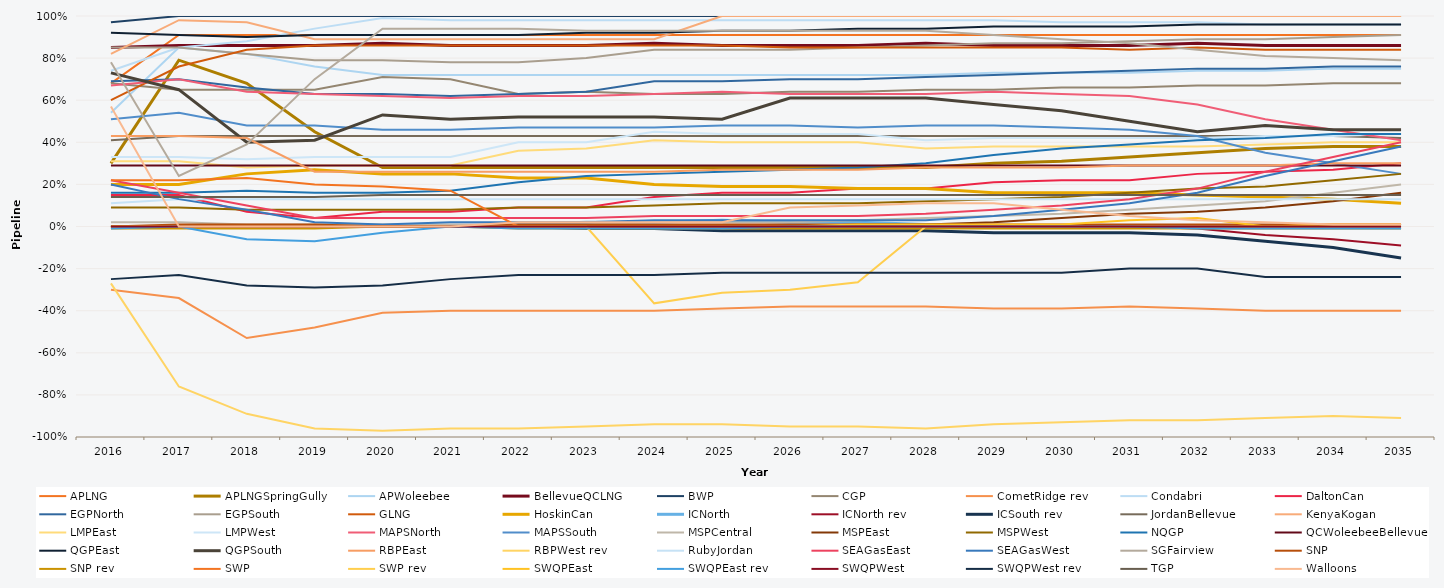
| Category | APLNG | APLNGSpringGully | APWoleebee | BellevueQCLNG | BWP | CGP | CometRidge rev | Condabri | DaltonCan | EGPNorth | EGPSouth | GLNG | HoskinCan | ICNorth | ICNorth rev | ICSouth rev | JordanBellevue | KenyaKogan | LMPEast | LMPWest | MAPSNorth | MAPSSouth | MSPCentral | MSPEast | MSPWest | NQGP | QCWoleebeeBellevue | QGPEast | QGPSouth | RBPEast | RBPWest rev | RubyJordan | SEAGasEast | SEAGasWest | SGFairview | SNP | SNP rev | SWP | SWP rev | SWQPEast | SWQPEast rev | SWQPWest | SWQPWest rev | TGP | Walloons |
|---|---|---|---|---|---|---|---|---|---|---|---|---|---|---|---|---|---|---|---|---|---|---|---|---|---|---|---|---|---|---|---|---|---|---|---|---|---|---|---|---|---|---|---|---|---|
| 2016.0 | 0.68 | 0.3 | 0.54 | 0.85 | 0.97 | 0.68 | -0.3 | 0.74 | 0.15 | 0.69 | 0.85 | 0.6 | 0.2 | 0 | 0 | 0 | 0.41 | 0.82 | 0.31 | 0.33 | 0.67 | 0.51 | 0.02 | 0 | 0.09 | 0.16 | 0.29 | 0.92 | 0.73 | 0.43 | -0.27 | 0.11 | 0.22 | 0.2 | 0.78 | 0 | -0.01 | 0.22 | 0 | 0 | -0.01 | 0 | -0.25 | 0.14 | 0.57 |
| 2017.0 | 0.91 | 0.79 | 0.85 | 0.86 | 1 | 0.65 | -0.34 | 0.85 | 0.15 | 0.7 | 0.85 | 0.76 | 0.2 | 0 | 0 | 0 | 0.43 | 0.98 | 0.31 | 0.33 | 0.7 | 0.54 | 0.02 | 0 | 0.09 | 0.16 | 0.29 | 0.91 | 0.65 | 0.43 | -0.76 | 0.13 | 0.16 | 0.13 | 0.24 | 0.01 | -0.01 | 0.22 | 0 | 0 | 0 | 0 | -0.23 | 0.14 | 0 |
| 2018.0 | 0.91 | 0.68 | 0.82 | 0.86 | 1 | 0.65 | -0.53 | 0.88 | 0.07 | 0.66 | 0.82 | 0.84 | 0.25 | 0 | 0 | 0 | 0.43 | 0.97 | 0.28 | 0.32 | 0.64 | 0.48 | 0.01 | 0 | 0.08 | 0.17 | 0.29 | 0.9 | 0.4 | 0.42 | -0.89 | 0.13 | 0.1 | 0.08 | 0.39 | 0.01 | -0.01 | 0.23 | 0 | 0 | -0.06 | 0 | -0.28 | 0.14 | 0 |
| 2019.0 | 0.91 | 0.45 | 0.76 | 0.86 | 1 | 0.65 | -0.48 | 0.94 | 0.04 | 0.63 | 0.79 | 0.86 | 0.27 | 0 | 0 | 0 | 0.43 | 0.89 | 0.29 | 0.33 | 0.63 | 0.48 | 0.01 | 0 | 0.08 | 0.16 | 0.29 | 0.91 | 0.41 | 0.26 | -0.96 | 0.13 | 0.04 | 0.02 | 0.7 | 0.01 | -0.01 | 0.2 | 0 | 0 | -0.07 | 0 | -0.29 | 0.14 | 0 |
| 2020.0 | 0.91 | 0.28 | 0.72 | 0.87 | 1 | 0.71 | -0.41 | 0.99 | 0.07 | 0.63 | 0.79 | 0.86 | 0.25 | 0 | 0 | 0 | 0.43 | 0.89 | 0.29 | 0.33 | 0.62 | 0.46 | 0.01 | 0 | 0.08 | 0.16 | 0.29 | 0.91 | 0.53 | 0.26 | -0.97 | 0.13 | 0.04 | 0.01 | 0.94 | 0 | 0 | 0.19 | 0 | 0 | -0.03 | 0 | -0.28 | 0.15 | 0 |
| 2021.0 | 0.91 | 0.28 | 0.72 | 0.86 | 1 | 0.7 | -0.4 | 0.98 | 0.07 | 0.62 | 0.78 | 0.86 | 0.25 | 0 | 0 | 0 | 0.43 | 0.89 | 0.29 | 0.33 | 0.61 | 0.46 | 0.01 | 0 | 0.08 | 0.17 | 0.29 | 0.91 | 0.51 | 0.26 | -0.96 | 0.13 | 0.04 | 0.02 | 0.94 | 0 | 0 | 0.17 | 0 | 0 | 0 | 0 | -0.25 | 0.15 | 0 |
| 2022.0 | 0.91 | 0.28 | 0.72 | 0.86 | 1 | 0.63 | -0.4 | 0.98 | 0.09 | 0.63 | 0.78 | 0.86 | 0.23 | 0.01 | 0 | 0 | 0.43 | 0.89 | 0.36 | 0.4 | 0.62 | 0.47 | 0.01 | 0 | 0.09 | 0.21 | 0.29 | 0.91 | 0.52 | 0.26 | -0.96 | 0.13 | 0.04 | 0.02 | 0.94 | 0.01 | -0.01 | 0 | 0 | 0 | -0.01 | 0 | -0.23 | 0.15 | 0.02 |
| 2023.0 | 0.91 | 0.28 | 0.72 | 0.86 | 1 | 0.64 | -0.4 | 0.98 | 0.09 | 0.64 | 0.8 | 0.86 | 0.23 | 0.02 | 0 | -0.01 | 0.43 | 0.89 | 0.37 | 0.4 | 0.62 | 0.47 | 0.01 | 0 | 0.09 | 0.24 | 0.29 | 0.92 | 0.52 | 0.26 | -0.95 | 0.13 | 0.04 | 0.02 | 0.93 | 0.01 | -0.01 | 0 | 0 | 0 | -0.01 | 0 | -0.23 | 0.15 | 0.02 |
| 2024.0 | 0.91 | 0.28 | 0.72 | 0.87 | 1 | 0.63 | -0.4 | 0.98 | 0.14 | 0.69 | 0.84 | 0.86 | 0.2 | 0.02 | 0 | -0.01 | 0.43 | 0.89 | 0.41 | 0.45 | 0.63 | 0.47 | 0.02 | 0 | 0.1 | 0.25 | 0.29 | 0.92 | 0.52 | 0.26 | -0.94 | 0.13 | 0.05 | 0.03 | 0.93 | 0.01 | -0.01 | 0 | -0.365 | 0 | -0.01 | 0 | -0.23 | 0.15 | 0.02 |
| 2025.0 | 0.91 | 0.28 | 0.72 | 0.86 | 1 | 0.63 | -0.39 | 0.98 | 0.16 | 0.69 | 0.84 | 0.86 | 0.19 | 0.03 | 0 | -0.02 | 0.43 | 1 | 0.4 | 0.44 | 0.64 | 0.48 | 0.02 | 0 | 0.11 | 0.26 | 0.29 | 0.93 | 0.51 | 0.27 | -0.94 | 0.13 | 0.05 | 0.03 | 0.93 | 0.01 | -0.01 | 0 | -0.315 | 0 | -0.01 | 0 | -0.22 | 0.15 | 0.02 |
| 2026.0 | 0.91 | 0.28 | 0.72 | 0.86 | 1 | 0.64 | -0.38 | 0.98 | 0.16 | 0.7 | 0.84 | 0.85 | 0.19 | 0.02 | 0 | -0.02 | 0.43 | 1 | 0.4 | 0.44 | 0.63 | 0.48 | 0.02 | 0 | 0.11 | 0.27 | 0.29 | 0.93 | 0.61 | 0.27 | -0.95 | 0.13 | 0.05 | 0.03 | 0.93 | 0.01 | -0.01 | 0 | -0.3 | 0 | 0 | 0 | -0.22 | 0.15 | 0.09 |
| 2027.0 | 0.91 | 0.28 | 0.72 | 0.86 | 1 | 0.64 | -0.38 | 0.98 | 0.18 | 0.7 | 0.85 | 0.85 | 0.18 | 0.02 | 0 | -0.02 | 0.43 | 1 | 0.4 | 0.44 | 0.63 | 0.47 | 0.03 | 0.01 | 0.11 | 0.28 | 0.29 | 0.94 | 0.61 | 0.27 | -0.95 | 0.13 | 0.05 | 0.03 | 0.93 | 0.01 | -0.01 | 0 | -0.265 | 0.01 | 0 | 0 | -0.22 | 0.15 | 0.1 |
| 2028.0 | 0.91 | 0.28 | 0.72 | 0.87 | 1 | 0.65 | -0.38 | 0.98 | 0.18 | 0.71 | 0.86 | 0.85 | 0.18 | 0.01 | 0 | -0.02 | 0.43 | 1 | 0.37 | 0.41 | 0.63 | 0.48 | 0.04 | 0.01 | 0.12 | 0.3 | 0.29 | 0.94 | 0.61 | 0.28 | -0.96 | 0.13 | 0.06 | 0.03 | 0.93 | 0.01 | -0.01 | 0 | 0 | 0.01 | 0 | 0 | -0.22 | 0.15 | 0.11 |
| 2029.0 | 0.91 | 0.3 | 0.73 | 0.86 | 1 | 0.65 | -0.39 | 0.98 | 0.21 | 0.72 | 0.87 | 0.85 | 0.16 | 0 | 0 | -0.03 | 0.43 | 1 | 0.38 | 0.42 | 0.64 | 0.48 | 0.05 | 0.02 | 0.13 | 0.34 | 0.29 | 0.95 | 0.58 | 0.28 | -0.94 | 0.13 | 0.08 | 0.05 | 0.91 | 0.01 | -0.01 | 0 | 0 | 0.01 | 0 | 0 | -0.22 | 0.15 | 0.11 |
| 2030.0 | 0.91 | 0.31 | 0.73 | 0.86 | 1 | 0.66 | -0.39 | 0.97 | 0.22 | 0.73 | 0.87 | 0.85 | 0.16 | 0 | 0 | -0.03 | 0.43 | 1 | 0.38 | 0.42 | 0.63 | 0.47 | 0.06 | 0.04 | 0.14 | 0.37 | 0.29 | 0.95 | 0.55 | 0.28 | -0.93 | 0.13 | 0.1 | 0.08 | 0.89 | 0.01 | -0.01 | 0 | 0 | 0.01 | 0 | 0 | -0.22 | 0.15 | 0.08 |
| 2031.0 | 0.91 | 0.33 | 0.73 | 0.86 | 1 | 0.66 | -0.38 | 0.97 | 0.22 | 0.74 | 0.88 | 0.84 | 0.16 | 0 | 0 | -0.03 | 0.43 | 1 | 0.38 | 0.42 | 0.62 | 0.46 | 0.08 | 0.06 | 0.16 | 0.39 | 0.29 | 0.95 | 0.5 | 0.29 | -0.92 | 0.13 | 0.13 | 0.11 | 0.87 | 0.01 | -0.01 | 0 | 0 | 0.03 | 0 | 0 | -0.2 | 0.15 | 0.05 |
| 2032.0 | 0.91 | 0.35 | 0.74 | 0.87 | 1 | 0.67 | -0.39 | 0.97 | 0.25 | 0.75 | 0.89 | 0.85 | 0.15 | 0 | -0.01 | -0.04 | 0.43 | 1 | 0.38 | 0.42 | 0.58 | 0.43 | 0.1 | 0.07 | 0.18 | 0.41 | 0.29 | 0.96 | 0.45 | 0.29 | -0.92 | 0.13 | 0.18 | 0.16 | 0.84 | 0.01 | -0.01 | 0 | 0 | 0.04 | -0.01 | 0 | -0.2 | 0.15 | 0.03 |
| 2033.0 | 0.91 | 0.37 | 0.74 | 0.86 | 1 | 0.67 | -0.4 | 0.96 | 0.26 | 0.75 | 0.89 | 0.84 | 0.14 | 0 | -0.04 | -0.07 | 0.43 | 1 | 0.39 | 0.43 | 0.51 | 0.35 | 0.12 | 0.09 | 0.19 | 0.42 | 0.29 | 0.96 | 0.48 | 0.29 | -0.91 | 0.13 | 0.26 | 0.24 | 0.81 | 0.01 | -0.01 | 0 | 0 | 0 | -0.01 | 0 | -0.24 | 0.15 | 0.02 |
| 2034.0 | 0.91 | 0.38 | 0.75 | 0.86 | 1 | 0.68 | -0.4 | 0.96 | 0.27 | 0.76 | 0.9 | 0.84 | 0.13 | 0 | -0.06 | -0.1 | 0.43 | 1 | 0.4 | 0.43 | 0.46 | 0.3 | 0.16 | 0.12 | 0.22 | 0.44 | 0.29 | 0.96 | 0.46 | 0.3 | -0.9 | 0.13 | 0.33 | 0.31 | 0.8 | 0.01 | -0.01 | 0.01 | 0 | 0.01 | -0.01 | 0 | -0.24 | 0.15 | 0.01 |
| 2035.0 | 0.91 | 0.38 | 0.75 | 0.86 | 1 | 0.68 | -0.4 | 0.96 | 0.3 | 0.76 | 0.91 | 0.84 | 0.11 | 0 | -0.09 | -0.15 | 0.42 | 1 | 0.4 | 0.44 | 0.41 | 0.25 | 0.2 | 0.16 | 0.25 | 0.44 | 0.29 | 0.96 | 0.46 | 0.3 | -0.91 | 0.13 | 0.4 | 0.38 | 0.79 | 0.01 | -0.01 | 0.01 | 0 | 0.01 | -0.01 | 0 | -0.24 | 0.15 | 0.01 |